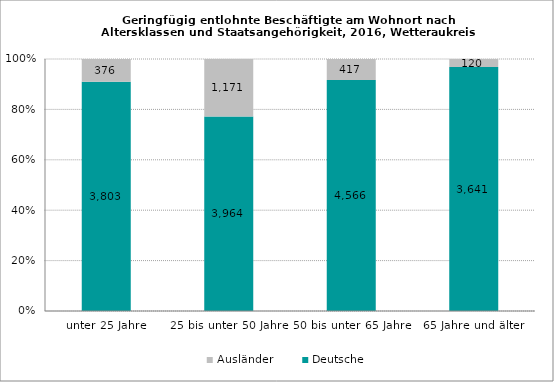
| Category | Deutsche | Ausländer |
|---|---|---|
| unter 25 Jahre | 3803 | 376 |
| 25 bis unter 50 Jahre | 3964 | 1171 |
| 50 bis unter 65 Jahre | 4566 | 417 |
| 65 Jahre und älter | 3641 | 120 |